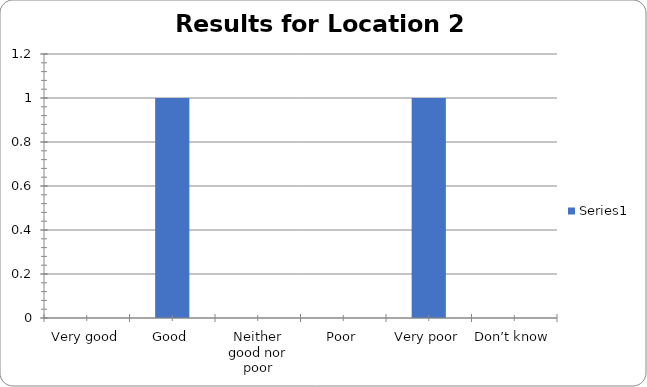
| Category | Series 0 |
|---|---|
| Very good | 0 |
| Good | 1 |
| Neither good nor poor | 0 |
| Poor | 0 |
| Very poor | 1 |
| Don’t know | 0 |